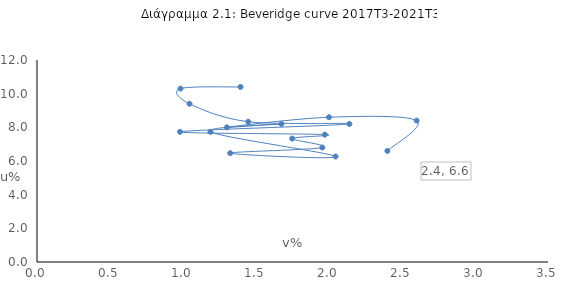
| Category | ΕΔ % ανεργίας |
|---|---|
| 1.393849044636956 | 10.4 |
| 0.9828009828009828 | 10.3 |
| 1.044678693943308 | 9.4 |
| 1.446831472800243 | 8.333 |
| 2.1396418395282573 | 8.2 |
| 0.9797008300002312 | 7.733 |
| 1.971480301232394 | 7.567 |
| 1.7481382797021248 | 7.333 |
| 1.9543884655446522 | 6.8 |
| 1.3233111832042588 | 6.467 |
| 2.044892470054591 | 6.267 |
| 1.1878159917007003 | 7.733 |
| 1.6741280137162213 | 8.2 |
| 1.3 | 8 |
| 2.0 | 8.6 |
| 2.6 | 8.4 |
| 2.4 | 6.6 |